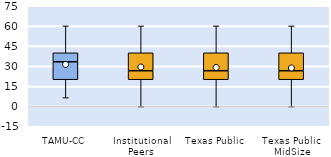
| Category | 25th | 50th | 75th |
|---|---|---|---|
| TAMU-CC | 20 | 13.333 | 6.667 |
| Institutional Peers | 20 | 6.667 | 13.333 |
| Texas Public | 20 | 6.667 | 13.333 |
| Texas Public MidSize | 20 | 6.667 | 13.333 |